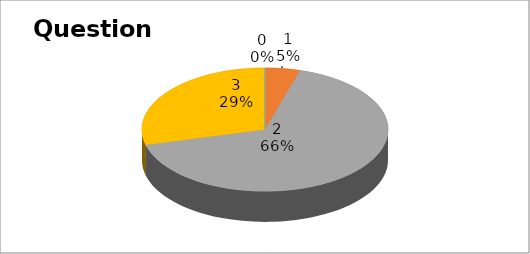
| Category | Series 0 |
|---|---|
| 0 | 0 |
| 1 | 6 |
| 2 | 87 |
| 3 | 38 |